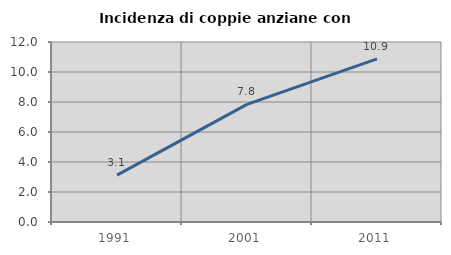
| Category | Incidenza di coppie anziane con figli |
|---|---|
| 1991.0 | 3.125 |
| 2001.0 | 7.843 |
| 2011.0 | 10.87 |